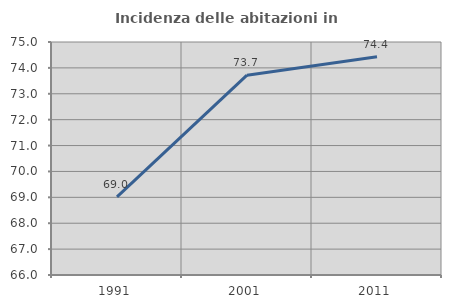
| Category | Incidenza delle abitazioni in proprietà  |
|---|---|
| 1991.0 | 69.018 |
| 2001.0 | 73.717 |
| 2011.0 | 74.43 |